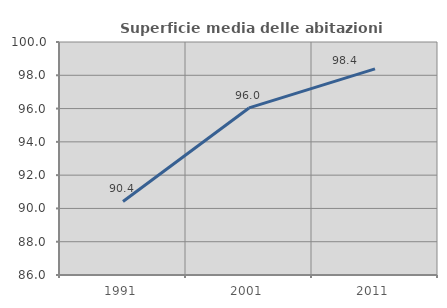
| Category | Superficie media delle abitazioni occupate |
|---|---|
| 1991.0 | 90.418 |
| 2001.0 | 96.038 |
| 2011.0 | 98.386 |